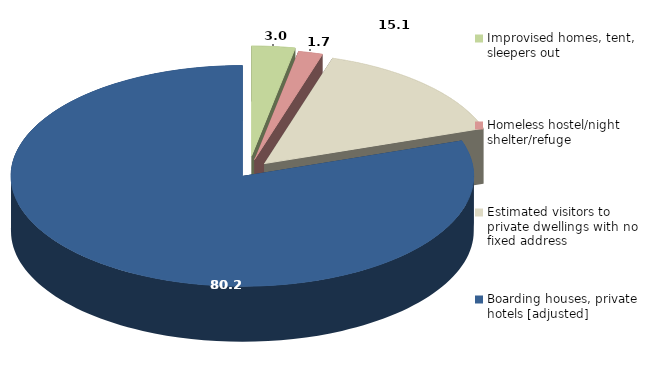
| Category | Series 0 | Series 1 |
|---|---|---|
| Improvised homes, tent, sleepers out | 3.038 |  |
| Homeless hostel/night shelter/refuge | 1.714 |  |
| Estimated visitors to private dwellings with no fixed address | 15.053 |  |
| Boarding houses, private hotels [adjusted] | 80.196 |  |